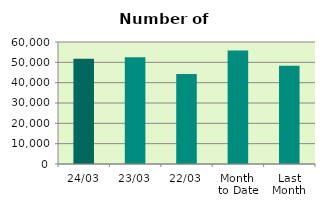
| Category | Series 0 |
|---|---|
| 24/03 | 51820 |
| 23/03 | 52558 |
| 22/03 | 44210 |
| Month 
to Date | 55849.444 |
| Last
Month | 48363.3 |